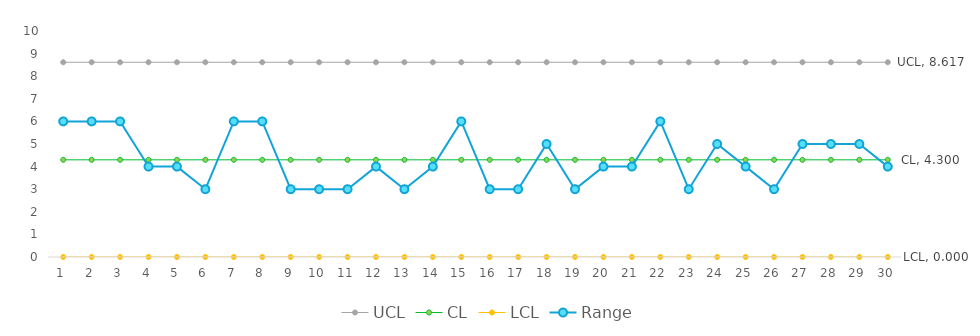
| Category | UCL | CL | LCL | Range |
|---|---|---|---|---|
| 1.0 | 8.617 | 4.3 | 0 | 6 |
| 2.0 | 8.617 | 4.3 | 0 | 6 |
| 3.0 | 8.617 | 4.3 | 0 | 6 |
| 4.0 | 8.617 | 4.3 | 0 | 4 |
| 5.0 | 8.617 | 4.3 | 0 | 4 |
| 6.0 | 8.617 | 4.3 | 0 | 3 |
| 7.0 | 8.617 | 4.3 | 0 | 6 |
| 8.0 | 8.617 | 4.3 | 0 | 6 |
| 9.0 | 8.617 | 4.3 | 0 | 3 |
| 10.0 | 8.617 | 4.3 | 0 | 3 |
| 11.0 | 8.617 | 4.3 | 0 | 3 |
| 12.0 | 8.617 | 4.3 | 0 | 4 |
| 13.0 | 8.617 | 4.3 | 0 | 3 |
| 14.0 | 8.617 | 4.3 | 0 | 4 |
| 15.0 | 8.617 | 4.3 | 0 | 6 |
| 16.0 | 8.617 | 4.3 | 0 | 3 |
| 17.0 | 8.617 | 4.3 | 0 | 3 |
| 18.0 | 8.617 | 4.3 | 0 | 5 |
| 19.0 | 8.617 | 4.3 | 0 | 3 |
| 20.0 | 8.617 | 4.3 | 0 | 4 |
| 21.0 | 8.617 | 4.3 | 0 | 4 |
| 22.0 | 8.617 | 4.3 | 0 | 6 |
| 23.0 | 8.617 | 4.3 | 0 | 3 |
| 24.0 | 8.617 | 4.3 | 0 | 5 |
| 25.0 | 8.617 | 4.3 | 0 | 4 |
| 26.0 | 8.617 | 4.3 | 0 | 3 |
| 27.0 | 8.617 | 4.3 | 0 | 5 |
| 28.0 | 8.617 | 4.3 | 0 | 5 |
| 29.0 | 8.617 | 4.3 | 0 | 5 |
| 30.0 | 8.617 | 4.3 | 0 | 4 |